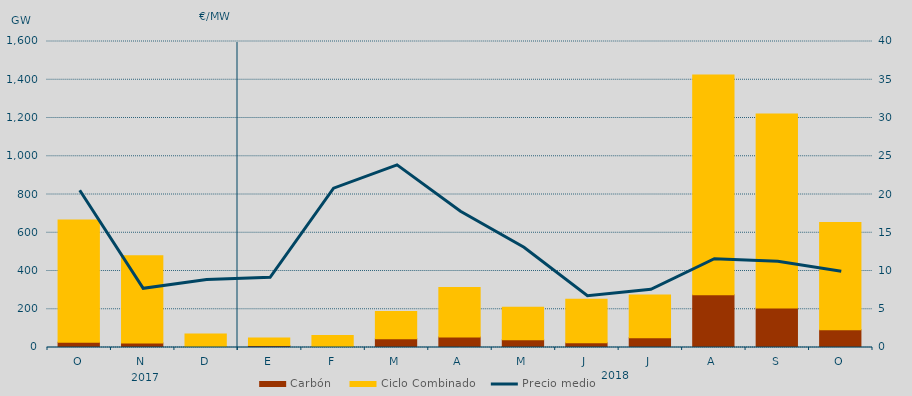
| Category | Carbón | Ciclo Combinado |
|---|---|---|
| O | 27914.4 | 638167.2 |
| N | 23926.9 | 455734.5 |
| D | 3200.6 | 67420.5 |
| E | 10696.2 | 39454.7 |
| F | 4341.9 | 58215.4 |
| M | 45246.3 | 142680.5 |
| A | 55123 | 258682.2 |
| M | 40054.5 | 170347.3 |
| J | 24939.8 | 227127.5 |
| J | 50362.4 | 224750.8 |
| A | 276044.1 | 1148967.5 |
| S | 206113.1 | 1015257.7 |
| O | 93052.3 | 560872.2 |